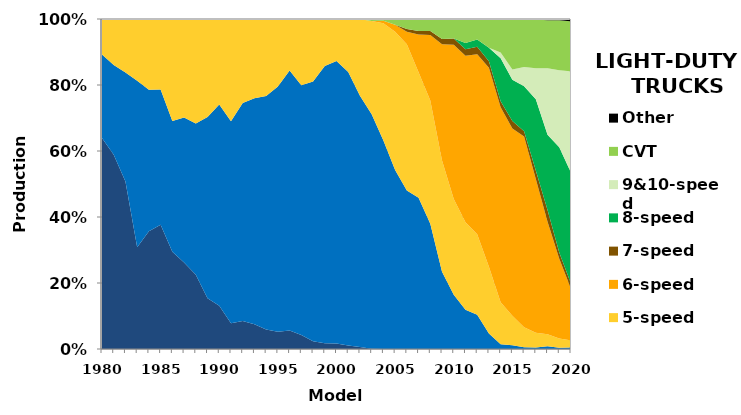
| Category | 3-speed | 4-speed | 5-speed | 6-speed | 7-speed | 8-speed | 9&10-speed | CVT | Other |
|---|---|---|---|---|---|---|---|---|---|
| 1980.0 | 0.639 | 0.253 | 0.108 | 0 | 0 | 0 | 0 | 0 | 0 |
| 1981.0 | 0.589 | 0.272 | 0.139 | 0 | 0 | 0 | 0 | 0 | 0 |
| 1982.0 | 0.508 | 0.33 | 0.162 | 0 | 0 | 0 | 0 | 0 | 0 |
| 1983.0 | 0.308 | 0.504 | 0.184 | 0 | 0 | 0 | 0 | 0 | 0.003 |
| 1984.0 | 0.357 | 0.428 | 0.214 | 0 | 0 | 0 | 0 | 0 | 0 |
| 1985.0 | 0.377 | 0.409 | 0.214 | 0 | 0 | 0 | 0 | 0 | 0 |
| 1986.0 | 0.295 | 0.396 | 0.309 | 0 | 0 | 0 | 0 | 0 | 0 |
| 1987.0 | 0.262 | 0.439 | 0.298 | 0 | 0 | 0 | 0 | 0 | 0.001 |
| 1988.0 | 0.225 | 0.459 | 0.316 | 0 | 0 | 0 | 0 | 0 | 0 |
| 1989.0 | 0.154 | 0.549 | 0.297 | 0 | 0 | 0 | 0 | 0 | 0 |
| 1990.0 | 0.131 | 0.61 | 0.259 | 0 | 0 | 0 | 0 | 0 | 0 |
| 1991.0 | 0.078 | 0.612 | 0.31 | 0 | 0 | 0 | 0 | 0 | 0 |
| 1992.0 | 0.085 | 0.661 | 0.254 | 0 | 0 | 0 | 0 | 0 | 0 |
| 1993.0 | 0.075 | 0.684 | 0.24 | 0 | 0 | 0 | 0 | 0 | 0 |
| 1994.0 | 0.059 | 0.707 | 0.233 | 0 | 0 | 0 | 0 | 0 | 0 |
| 1995.0 | 0.052 | 0.743 | 0.204 | 0 | 0 | 0 | 0 | 0 | 0 |
| 1996.0 | 0.056 | 0.788 | 0.156 | 0 | 0 | 0 | 0 | 0 | 0 |
| 1997.0 | 0.042 | 0.757 | 0.201 | 0 | 0 | 0 | 0 | 0 | 0 |
| 1998.0 | 0.024 | 0.787 | 0.189 | 0 | 0 | 0 | 0 | 0 | 0 |
| 1999.0 | 0.017 | 0.841 | 0.142 | 0 | 0 | 0 | 0 | 0 | 0 |
| 2000.0 | 0.016 | 0.856 | 0.127 | 0 | 0 | 0 | 0 | 0 | 0 |
| 2001.0 | 0.01 | 0.829 | 0.16 | 0 | 0 | 0 | 0 | 0 | 0 |
| 2002.0 | 0.006 | 0.761 | 0.233 | 0 | 0 | 0 | 0 | 0 | 0 |
| 2003.0 | 0.001 | 0.711 | 0.282 | 0 | 0 | 0 | 0 | 0.006 | 0 |
| 2004.0 | 0 | 0.632 | 0.355 | 0.008 | 0 | 0 | 0 | 0.006 | 0 |
| 2005.0 | 0 | 0.543 | 0.419 | 0.021 | 0 | 0 | 0 | 0.018 | 0 |
| 2006.0 | 0 | 0.48 | 0.443 | 0.038 | 0.008 | 0 | 0 | 0.031 | 0 |
| 2007.0 | 0 | 0.458 | 0.38 | 0.115 | 0.01 | 0 | 0 | 0.037 | 0 |
| 2008.0 | 0 | 0.379 | 0.374 | 0.199 | 0.012 | 0 | 0 | 0.036 | 0 |
| 2009.0 | 0 | 0.234 | 0.337 | 0.352 | 0.016 | 0 | 0 | 0.06 | 0 |
| 2010.0 | 0 | 0.164 | 0.291 | 0.467 | 0.019 | 0 | 0 | 0.059 | 0 |
| 2011.0 | 0 | 0.119 | 0.265 | 0.505 | 0.019 | 0.019 | 0 | 0.073 | 0 |
| 2012.0 | 0 | 0.104 | 0.244 | 0.546 | 0.022 | 0.022 | 0 | 0.062 | 0 |
| 2013.0 | 0 | 0.047 | 0.202 | 0.603 | 0.02 | 0.04 | 0 | 0.087 | 0 |
| 2014.0 | 0 | 0.015 | 0.127 | 0.591 | 0.018 | 0.13 | 0.018 | 0.102 | 0 |
| 2015.0 | 0 | 0.011 | 0.09 | 0.567 | 0.022 | 0.125 | 0.031 | 0.153 | 0 |
| 2016.0 | 0 | 0.006 | 0.06 | 0.578 | 0.016 | 0.137 | 0.058 | 0.144 | 0.001 |
| 2017.0 | 0 | 0.005 | 0.044 | 0.466 | 0.026 | 0.216 | 0.094 | 0.148 | 0.002 |
| 2018.0 | 0 | 0.008 | 0.036 | 0.341 | 0.035 | 0.228 | 0.202 | 0.146 | 0.004 |
| 2019.0 | 0 | 0.004 | 0.028 | 0.242 | 0.019 | 0.318 | 0.234 | 0.151 | 0.004 |
| 2020.0 | 0 | 0.005 | 0.021 | 0.156 | 0.016 | 0.336 | 0.307 | 0.152 | 0.007 |